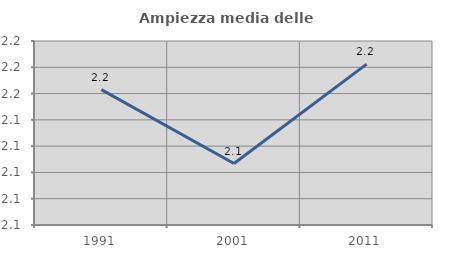
| Category | Ampiezza media delle famiglie |
|---|---|
| 1991.0 | 2.163 |
| 2001.0 | 2.107 |
| 2011.0 | 2.182 |